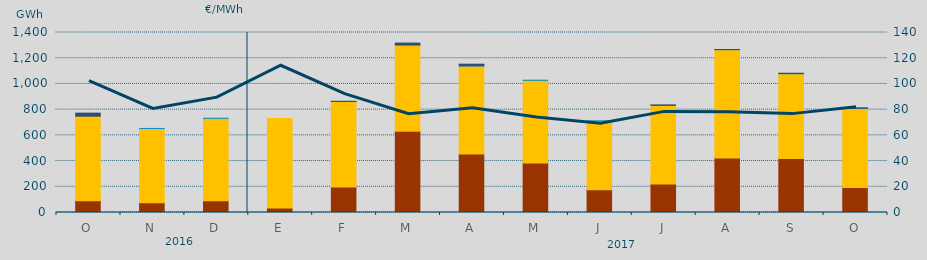
| Category | Carbón | Ciclo Combinado | Hidráulica | Nuclear | Consumo Bombeo |
|---|---|---|---|---|---|
| O | 91594.1 | 657310.6 | 0 | 0 | 23959.3 |
| N | 76065.2 | 577468 | 240 | 0 | 0 |
| D | 91091.6 | 640964.5 | 1160 | 0 | 0 |
| E | 35729 | 696156.2 | 0 | 0 | 0 |
| F | 198516.2 | 665095.2 | 712.6 | 0 | 139.6 |
| M | 631868 | 670791.6 | 1411.7 | 0 | 13667.9 |
| A | 454829.4 | 684899.6 | 1412 | 9600 | 2812.1 |
| M | 384999.4 | 642959.4 | 538 | 0 | 0 |
| J | 176734.4 | 535700.2 | 240 | 0 | 0 |
| J | 221645.5 | 612390.3 | 245 | 0 | 1709.9 |
| A | 424631 | 842008.2 | 714.3 | 0 | 227.4 |
| S | 419522.2 | 659557.1 | 1903.2 | 0 | 2247.5 |
| O | 195163.5 | 613794.4 | 1865.1 | 0 | 2877.8 |